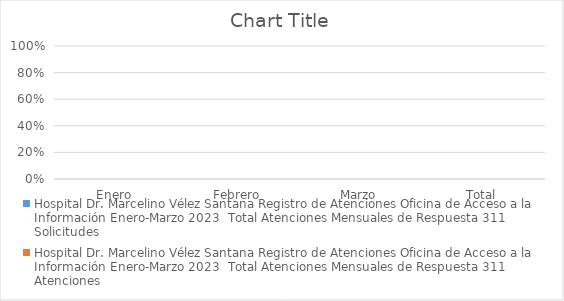
| Category | Hospital Dr. Marcelino Vélez Santana |
|---|---|
| Enero | 0 |
| Febrero | 0 |
| Marzo | 0 |
| Total | 0 |